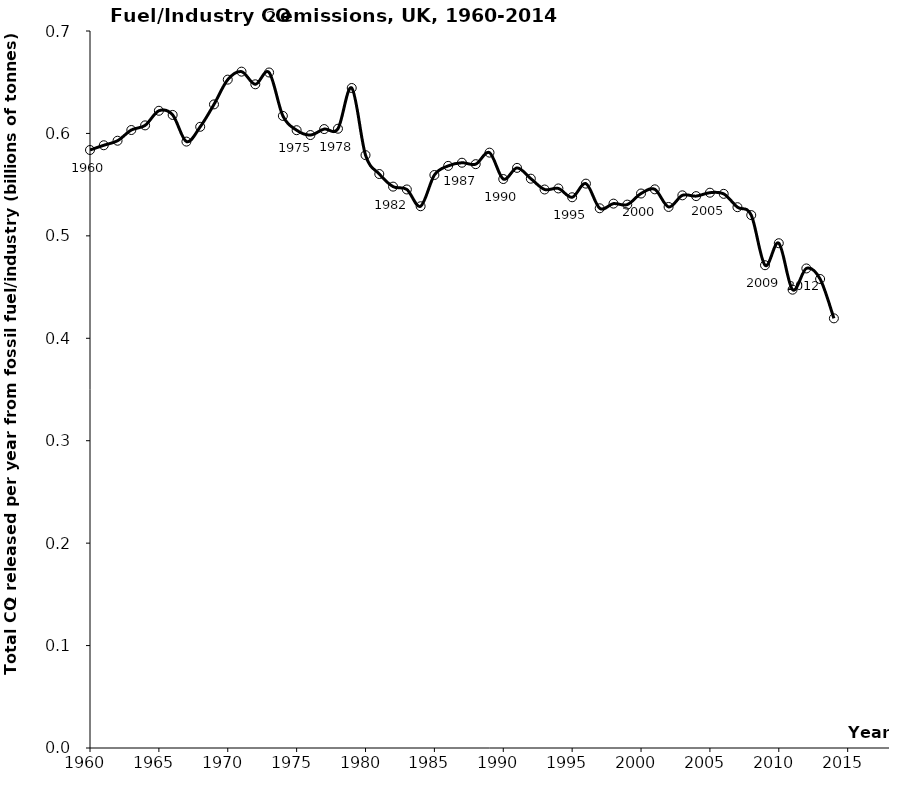
| Category | Series 0 |
|---|---|
| 1960.0 | 0.584 |
| 1961.0 | 0.588 |
| 1962.0 | 0.593 |
| 1963.0 | 0.603 |
| 1964.0 | 0.608 |
| 1965.0 | 0.622 |
| 1966.0 | 0.618 |
| 1967.0 | 0.592 |
| 1968.0 | 0.606 |
| 1969.0 | 0.628 |
| 1970.0 | 0.653 |
| 1971.0 | 0.66 |
| 1972.0 | 0.648 |
| 1973.0 | 0.659 |
| 1974.0 | 0.617 |
| 1975.0 | 0.603 |
| 1976.0 | 0.598 |
| 1977.0 | 0.604 |
| 1978.0 | 0.605 |
| 1979.0 | 0.644 |
| 1980.0 | 0.579 |
| 1981.0 | 0.56 |
| 1982.0 | 0.548 |
| 1983.0 | 0.545 |
| 1984.0 | 0.529 |
| 1985.0 | 0.559 |
| 1986.0 | 0.568 |
| 1987.0 | 0.571 |
| 1988.0 | 0.57 |
| 1989.0 | 0.581 |
| 1990.0 | 0.555 |
| 1991.0 | 0.566 |
| 1992.0 | 0.556 |
| 1993.0 | 0.545 |
| 1994.0 | 0.546 |
| 1995.0 | 0.538 |
| 1996.0 | 0.551 |
| 1997.0 | 0.527 |
| 1998.0 | 0.531 |
| 1999.0 | 0.531 |
| 2000.0 | 0.541 |
| 2001.0 | 0.545 |
| 2002.0 | 0.528 |
| 2003.0 | 0.54 |
| 2004.0 | 0.539 |
| 2005.0 | 0.542 |
| 2006.0 | 0.541 |
| 2007.0 | 0.528 |
| 2008.0 | 0.52 |
| 2009.0 | 0.471 |
| 2010.0 | 0.493 |
| 2011.0 | 0.447 |
| 2012.0 | 0.468 |
| 2013.0 | 0.458 |
| 2014.0 | 0.419 |